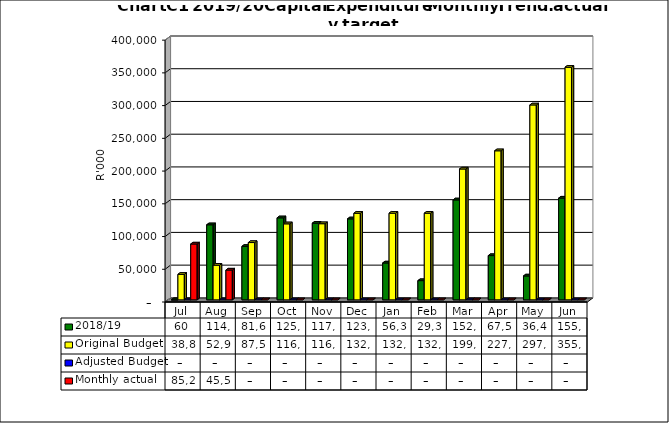
| Category | 2018/19 | Original Budget | Adjusted Budget | Monthly actual |
|---|---|---|---|---|
| Jul | 59892 | 38885000 | 0 | 85297669.12 |
| Aug | 114658356.076 | 52927000 | 0 | 45515291.767 |
| Sep | 81613647.633 | 87521000 | 0 | 0 |
| Oct | 125253452.407 | 116093000 | 0 | 0 |
| Nov | 117057421.925 | 116300000 | 0 | 0 |
| Dec | 123680771.708 | 132266000 | 0 | 0 |
| Jan | 56304819.372 | 132336000 | 0 | 0 |
| Feb | 29352943.088 | 132336000 | 0 | 0 |
| Mar | 152645868.565 | 199883000 | 0 | 0 |
| Apr | 67570203.105 | 227676000 | 0 | 0 |
| May | 36486409.167 | 297703000 | 0 | 0 |
| Jun | 155412588.422 | 355259999.6 | 0 | 0 |